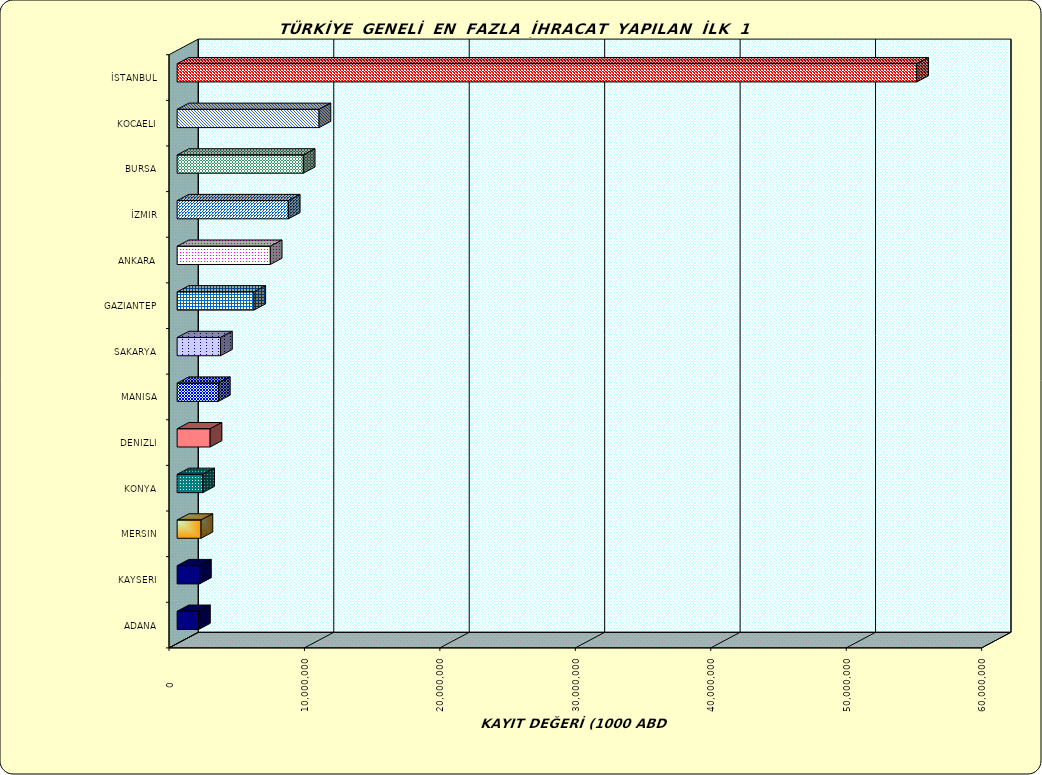
| Category | Series 0 |
|---|---|
| İSTANBUL | 54609655.548 |
| KOCAELI | 10478759.562 |
| BURSA | 9315820.054 |
| İZMIR | 8211371.555 |
| ANKARA | 6878693.79 |
| GAZIANTEP | 5665941.638 |
| SAKARYA | 3207353.525 |
| MANISA | 3047960.719 |
| DENIZLI | 2437736.675 |
| KONYA | 1892667.254 |
| MERSIN | 1765417.287 |
| KAYSERI | 1654881.81 |
| ADANA | 1581682.5 |